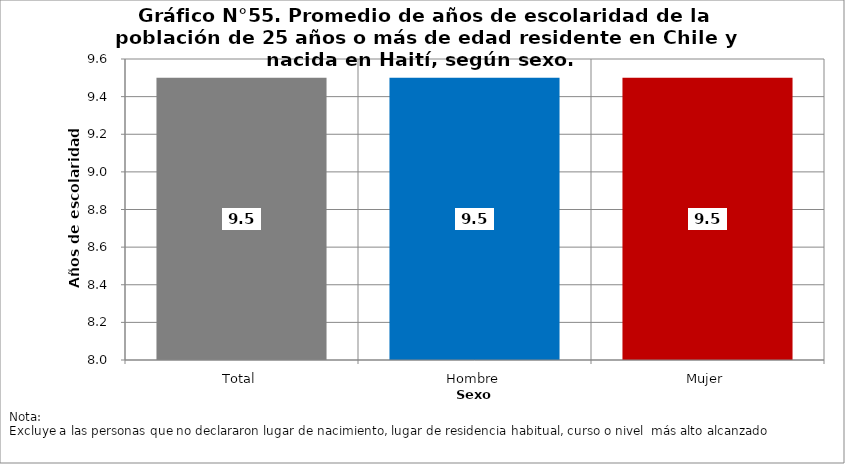
| Category | Series 0 |
|---|---|
| Total | 9.5 |
| Hombre | 9.5 |
| Mujer | 9.5 |